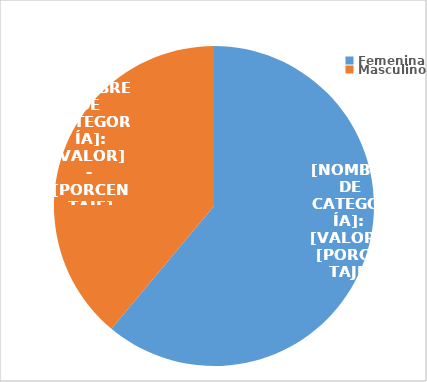
| Category | Series 0 |
|---|---|
| Femenina | 3450 |
| Masculino | 2199 |